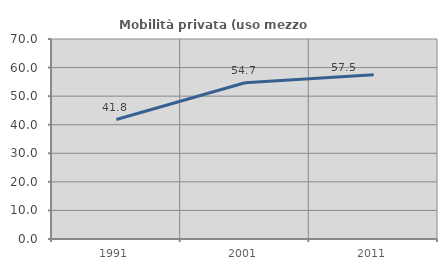
| Category | Mobilità privata (uso mezzo privato) |
|---|---|
| 1991.0 | 41.803 |
| 2001.0 | 54.706 |
| 2011.0 | 57.463 |